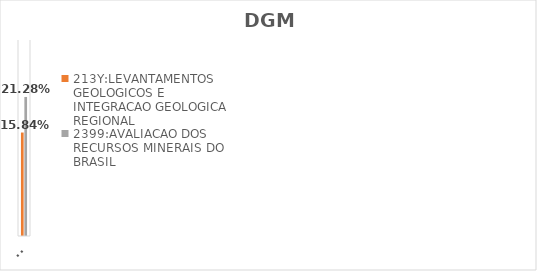
| Category | 213Y:LEVANTAMENTOS GEOLOGICOS E INTEGRACAO GEOLOGICA REGIONAL | 2399:AVALIACAO DOS RECURSOS MINERAIS DO BRASIL |
|---|---|---|
| EXECUTADO | 0.158 | 0.213 |